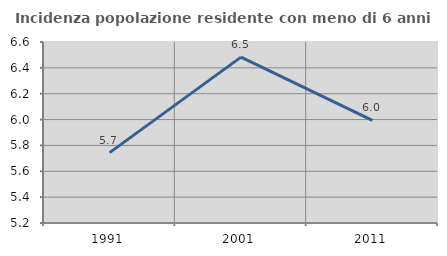
| Category | Incidenza popolazione residente con meno di 6 anni |
|---|---|
| 1991.0 | 5.744 |
| 2001.0 | 6.483 |
| 2011.0 | 5.994 |